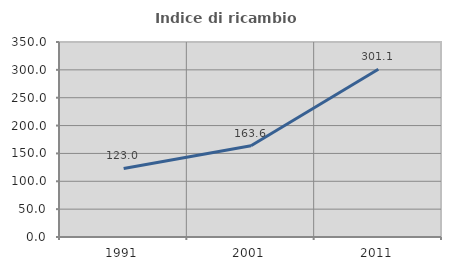
| Category | Indice di ricambio occupazionale  |
|---|---|
| 1991.0 | 123.026 |
| 2001.0 | 163.639 |
| 2011.0 | 301.051 |